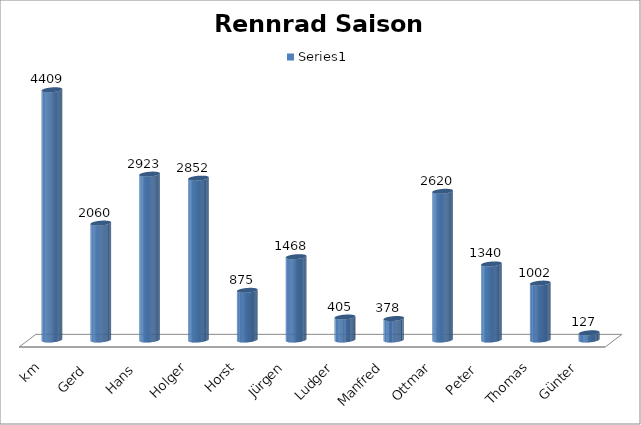
| Category | Series 0 |
|---|---|
| km | 4409 |
| Gerd  | 2060 |
| Hans  | 2923 |
| Holger | 2852 |
| Horst | 875 |
| Jürgen | 1468 |
| Ludger | 405 |
| Manfred | 378 |
| Ottmar  | 2620 |
| Peter  | 1340 |
| Thomas | 1002 |
| Günter | 127 |